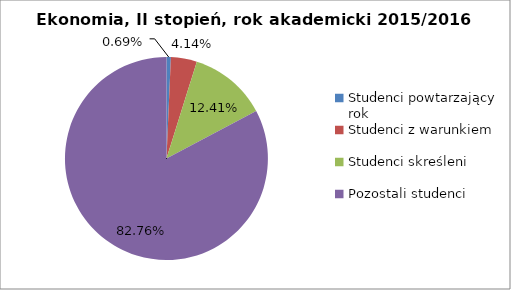
| Category | Series 0 |
|---|---|
| Studenci powtarzający rok | 1 |
| Studenci z warunkiem | 6 |
| Studenci skreśleni | 18 |
| Pozostali studenci | 120 |